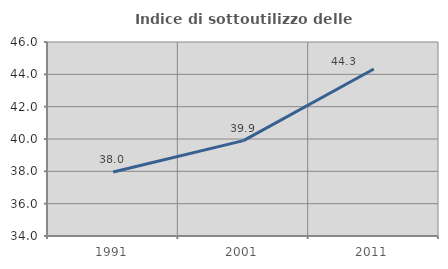
| Category | Indice di sottoutilizzo delle abitazioni  |
|---|---|
| 1991.0 | 37.959 |
| 2001.0 | 39.898 |
| 2011.0 | 44.333 |